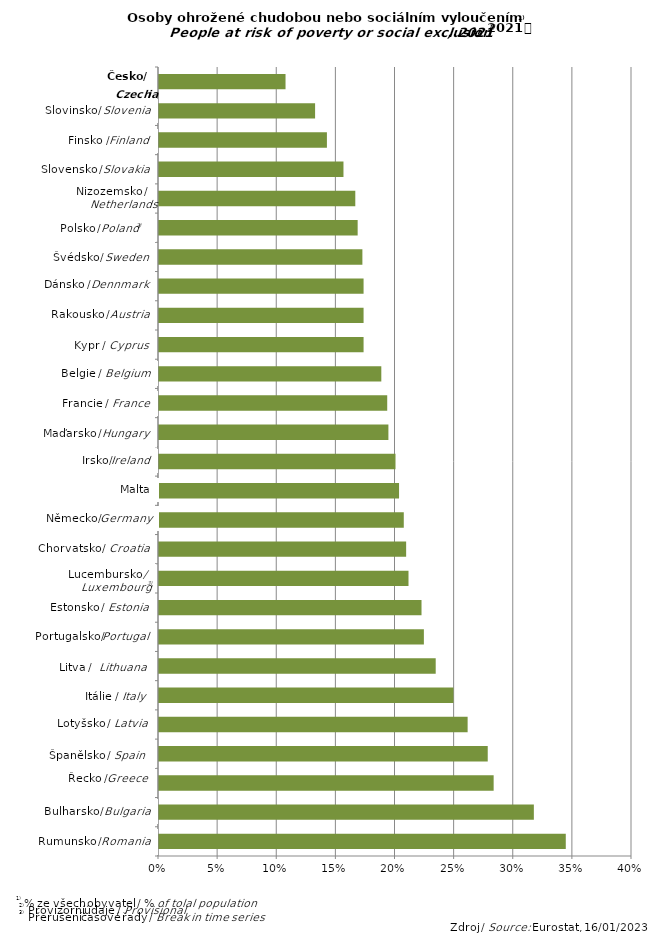
| Category | Series 0 |
|---|---|
| Romania | 0.344 |
| Bulgaria | 0.317 |
| Greece | 0.283 |
| Spain | 0.278 |
| Latvia | 0.261 |
| Italy | 0.249 |
| Lithuania | 0.234 |
| Portugal | 0.224 |
| Estonia | 0.222 |
| Luxembourg | 0.211 |
| Croatia | 0.209 |
| Germany | 0.207 |
| Malta | 0.203 |
| Ireland | 0.2 |
| Hungary | 0.194 |
| France | 0.193 |
| Belgium | 0.188 |
| Cyprus | 0.173 |
| Austria | 0.173 |
| Denmark | 0.173 |
| Sweden | 0.172 |
| Poland | 0.168 |
| Netherlands | 0.166 |
| Slovakia | 0.156 |
| Finland | 0.142 |
| Slovenia | 0.132 |
| Czechia | 0.107 |